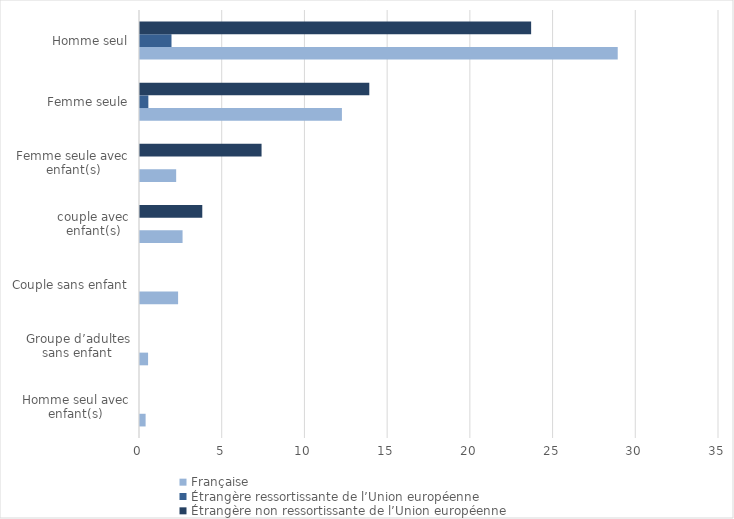
| Category | Française | Étrangère ressortissante de l’Union européenne | Étrangère non ressortissante de l’Union européenne |
|---|---|---|---|
| Homme seul avec enfant(s) | 0.339 | 0 | 0 |
| Groupe d’adultes sans enfant | 0.488 | 0 | 0 |
| Couple sans enfant | 2.303 | 0 | 0 |
| couple avec enfant(s) | 2.573 | 0 | 3.765 |
| Femme seule avec enfant(s) | 2.186 | 0 | 7.348 |
| Femme seule | 12.206 | 0.505 | 13.861 |
| Homme seul | 28.878 | 1.904 | 23.644 |